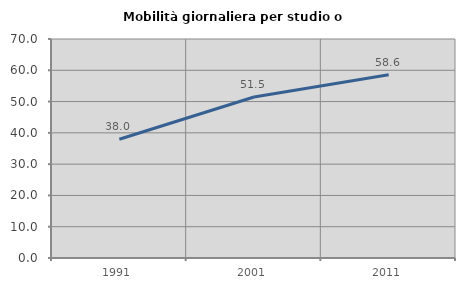
| Category | Mobilità giornaliera per studio o lavoro |
|---|---|
| 1991.0 | 37.967 |
| 2001.0 | 51.457 |
| 2011.0 | 58.562 |